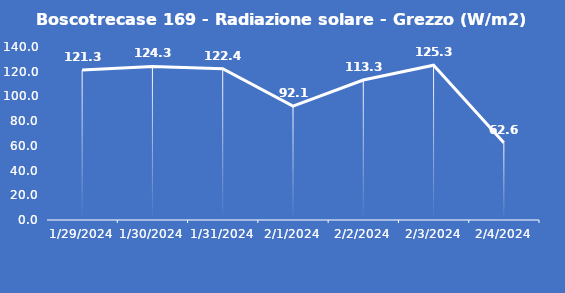
| Category | Boscotrecase 169 - Radiazione solare - Grezzo (W/m2) |
|---|---|
| 1/29/24 | 121.3 |
| 1/30/24 | 124.3 |
| 1/31/24 | 122.4 |
| 2/1/24 | 92.1 |
| 2/2/24 | 113.3 |
| 2/3/24 | 125.3 |
| 2/4/24 | 62.6 |